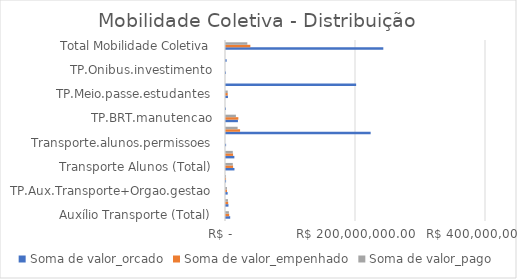
| Category | Soma de valor_orcado | Soma de valor_empenhado | Soma de valor_pago |
|---|---|---|---|
| Auxílio Transporte (Total) | 6460308 | 4925803.91 | 4472854.57 |
| TP.Aux.Transporte | 3799742 | 3371447.91 | 3011164.13 |
| TP.Aux.Transporte+Orgao.gestao | 2560566 | 1483556 | 1431997.39 |
| TP.tarifa.auxilio | 100000 | 70800 | 29693.05 |
| Transporte Alunos (Total) | 13002548 | 10886351.6 | 10453789.2 |
| Transporte.alunos | 12852548 | 10886351.6 | 10453789.2 |
| Transporte.alunos.permissoes | 150000 | 0 | 0 |
| Transporte Público (Total) | 222551257 | 21640361.15 | 17880411.94 |
| TP.BRT.manutencao | 18348257 | 19009966.12 | 15250016.91 |
| TP.investimento | 1000 | 0 | 0 |
| TP.Meio.passe.estudantes | 3000000 | 2630395.03 | 2630395.03 |
| TP.Metro.investimento | 200200000 | 0 | 0 |
| TP.Onibus.investimento | 1000 | 0 | 0 |
| TP.Onibus.projeto | 1001000 | 0 | 0 |
| Total Mobilidade Coletiva | 242014113 | 37452516.66 | 32807055.71 |